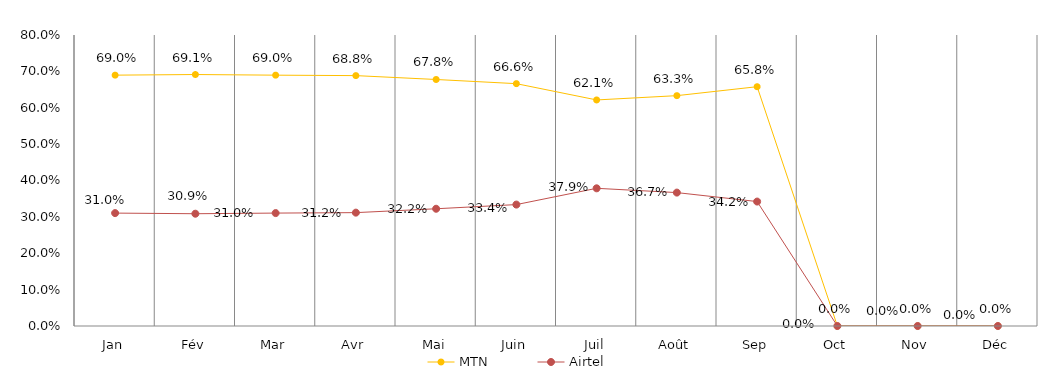
| Category | MTN | Airtel |
|---|---|---|
| Jan | 0.69 | 0.31 |
| Fév | 0.691 | 0.309 |
| Mar | 0.69 | 0.31 |
| Avr | 0.688 | 0.312 |
| Mai | 0.678 | 0.322 |
| Juin | 0.666 | 0.334 |
| Juil | 0.621 | 0.379 |
| Août | 0.633 | 0.367 |
| Sep | 0.658 | 0.342 |
| Oct | 0 | 0 |
| Nov | 0 | 0 |
| Déc | 0 | 0 |